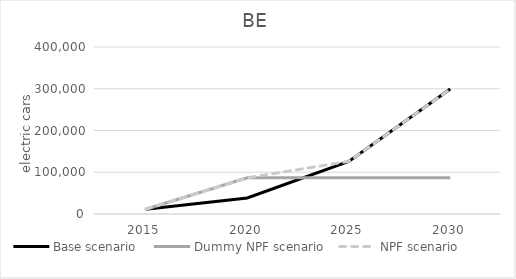
| Category | Base scenario | Dummy NPF scenario | NPF scenario |
|---|---|---|---|
| 2015.0 | 11494.371 | 11494.371 | 11494.371 |
| 2020.0 | 38403.672 | 86663 | 86663 |
| 2025.0 | 125992.828 | 86663 | 125992.828 |
| 2030.0 | 299193.177 | 86663 | 299193.177 |